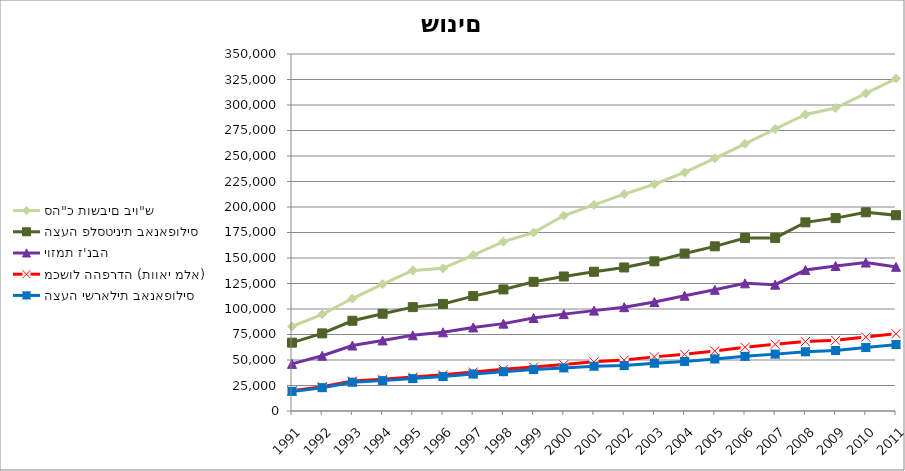
| Category | סה"כ תושבים ביו"ש | הצעה פלסטינית באנאפוליס | יוזמת ז'נבה | מכשול ההפרדה (תוואי מלא) | הצעה ישראלית באנאפוליס |
|---|---|---|---|---|---|
| 1991.0 | 82865 | 67014 | 46185 | 19796 | 19224 |
| 1992.0 | 94834 | 76108 | 54171 | 23864 | 22896 |
| 1993.0 | 110259 | 88454 | 64184 | 29412 | 28233 |
| 1994.0 | 124336 | 95390 | 69177 | 31116 | 29778 |
| 1995.0 | 137860 | 101854 | 74230 | 33266 | 31766 |
| 1996.0 | 139918 | 105003 | 77141 | 35563 | 33733 |
| 1997.0 | 152758 | 112656 | 81928 | 38221 | 36214 |
| 1998.0 | 166023 | 119185 | 85661 | 40849 | 38551 |
| 1999.0 | 174895 | 126659 | 91179 | 43122 | 40619 |
| 2000.0 | 191608 | 131885 | 94970 | 45524 | 42271 |
| 2001.0 | 202111 | 136510 | 98415 | 48179 | 43936 |
| 2002.0 | 212648 | 140727 | 101801 | 49917 | 44516 |
| 2003.0 | 222336 | 146723 | 106833 | 53056 | 46870 |
| 2004.0 | 233914 | 154372 | 113008 | 55563 | 48581 |
| 2005.0 | 247654 | 161435 | 118828 | 58905 | 51036 |
| 2006.0 | 261953 | 169562 | 125152 | 62499 | 53596 |
| 2007.0 | 276456 | 169651 | 123863 | 65340 | 55757 |
| 2008.0 | 290742 | 184962 | 138196 | 68019 | 58066 |
| 2009.0 | 297009 | 189116 | 142169 | 69251 | 59313 |
| 2010.0 | 311431 | 194820 | 145526 | 72464 | 62201 |
| 2011.0 | 325894 | 191946 | 141347 | 75736 | 65145 |